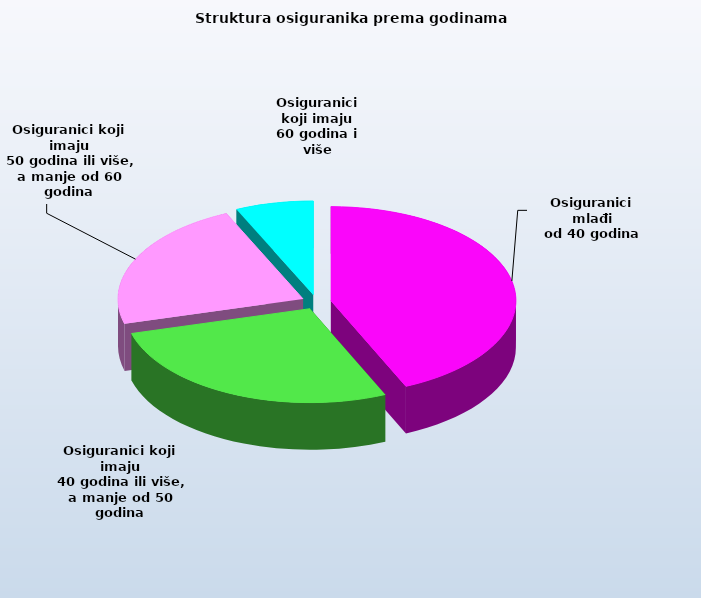
| Category | Series 0 |
|---|---|
| Osiguranici mlađi
od 40 godina | 665913 |
| Osiguranici koji imaju
 40 godina ili više, a manje od 50 godina | 420863 |
| Osiguranici koji imaju
 50 godina ili više, a manje od 60 godina | 344971 |
| Osiguranici koji imaju
60 godina i više | 104500 |